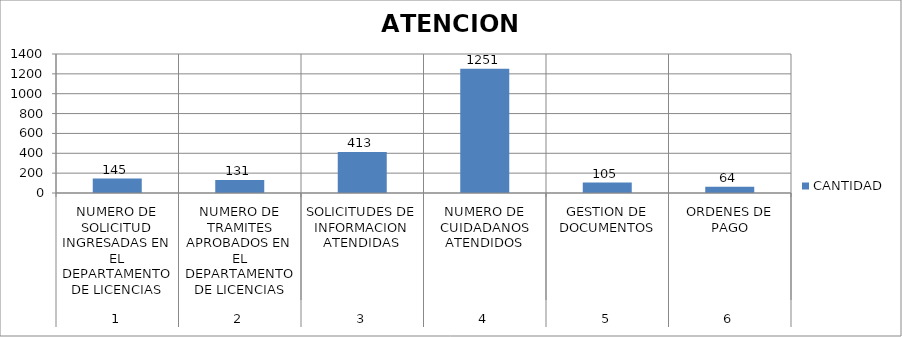
| Category | CANTIDAD |
|---|---|
| 0 | 145 |
| 1 | 131 |
| 2 | 413 |
| 3 | 1251 |
| 4 | 105 |
| 5 | 64 |